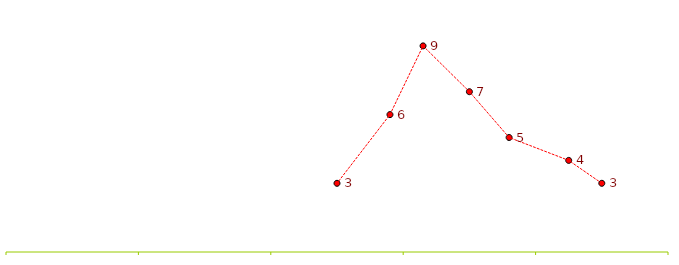
| Category | Series 0 |
|---|---|
| 90.0 | 3 |
| 85.0 | 4 |
| 76.0 | 5 |
| 70.0 | 7 |
| 63.0 | 9 |
| 58.0 | 6 |
| 50.0 | 3 |